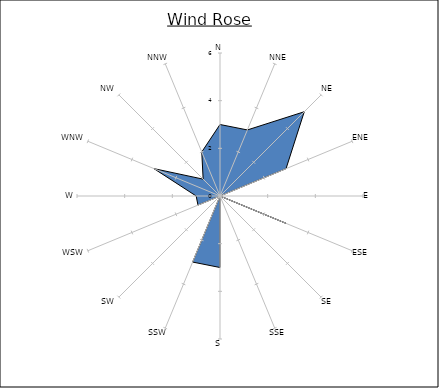
| Category | Series 0 |
|---|---|
| N | 3 |
| NNE | 3 |
| NE | 5 |
| ENE | 3 |
| E | 0 |
| ESE | 3 |
| SE | 0 |
| SSE | 0 |
| S | 3 |
| SSW | 3 |
| SW | 0 |
| WSW | 1 |
| W | 1 |
| WNW | 3 |
| NW | 1 |
| NNW | 2 |